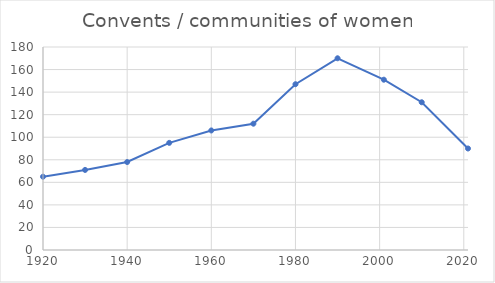
| Category | Convents / communities of women |
|---|---|
| 1920.0 | 65 |
| 1930.0 | 71 |
| 1940.0 | 78 |
| 1950.0 | 95 |
| 1960.0 | 106 |
| 1970.0 | 112 |
| 1980.0 | 147 |
| 1990.0 | 170 |
| 2001.0 | 151 |
| 2010.0 | 131 |
| 2021.0 | 90 |